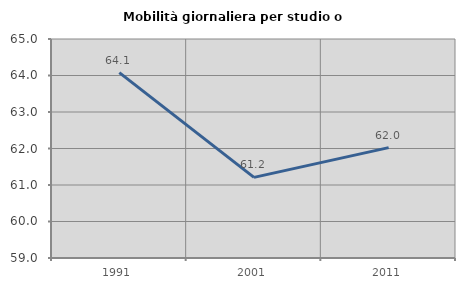
| Category | Mobilità giornaliera per studio o lavoro |
|---|---|
| 1991.0 | 64.08 |
| 2001.0 | 61.209 |
| 2011.0 | 62.023 |